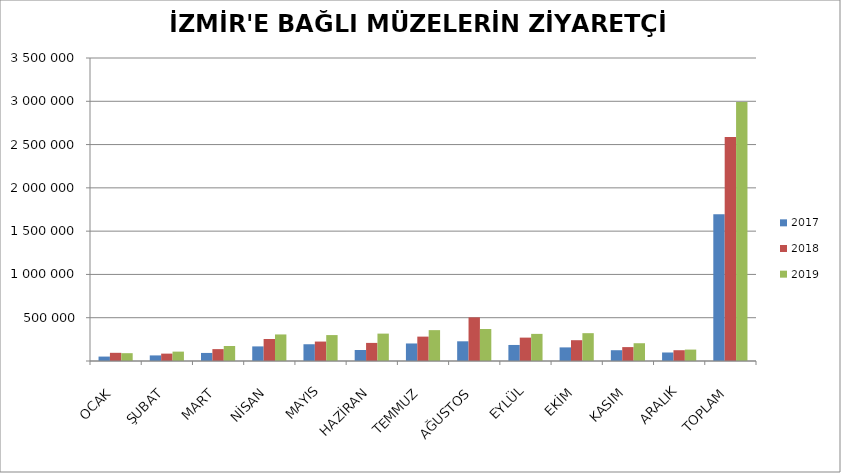
| Category | 2017 | 2018 | 2019 |
|---|---|---|---|
| OCAK | 51186 | 94545 | 90406 |
| ŞUBAT | 64508 | 85251 | 108321 |
| MART | 93107 | 137343 | 173542 |
| NİSAN | 168661 | 254028 | 306745 |
| MAYIS | 193570 | 224563 | 299441 |
| HAZİRAN | 127339 | 208960 | 316361 |
| TEMMUZ | 202524 | 281632 | 356504 |
| AĞUSTOS | 227514 | 504239 | 369370 |
| EYLÜL | 185264 | 270117 | 313284 |
| EKİM | 157214 | 240286 | 321498 |
| KASIM | 124607 | 160610 | 205258 |
| ARALIK | 98329 | 124645 | 131881 |
|  TOPLAM | 1693823 | 2586219 | 2992611 |